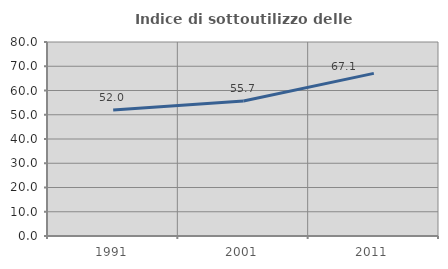
| Category | Indice di sottoutilizzo delle abitazioni  |
|---|---|
| 1991.0 | 52 |
| 2001.0 | 55.689 |
| 2011.0 | 67.052 |